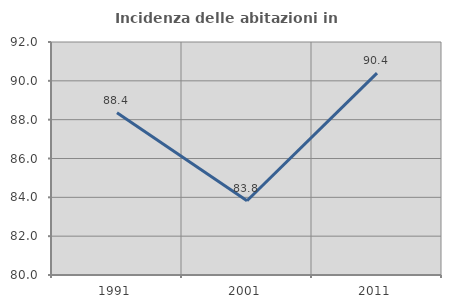
| Category | Incidenza delle abitazioni in proprietà  |
|---|---|
| 1991.0 | 88.356 |
| 2001.0 | 83.824 |
| 2011.0 | 90.4 |